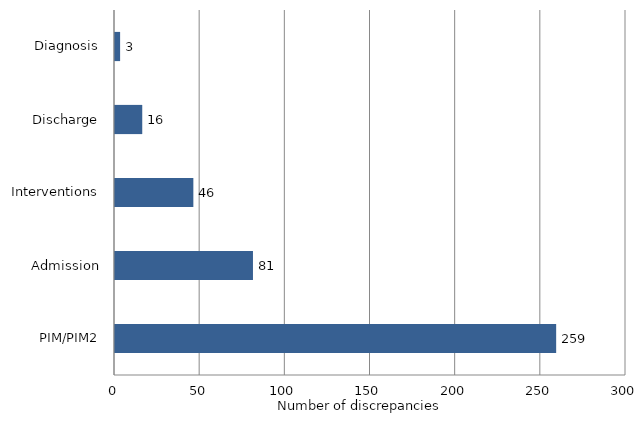
| Category | N of disc |
|---|---|
| PIM/PIM2 | 259 |
| Admission | 81 |
| Interventions | 46 |
| Discharge | 16 |
| Diagnosis | 3 |